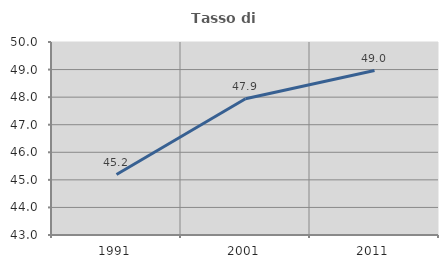
| Category | Tasso di occupazione   |
|---|---|
| 1991.0 | 45.192 |
| 2001.0 | 47.94 |
| 2011.0 | 48.966 |